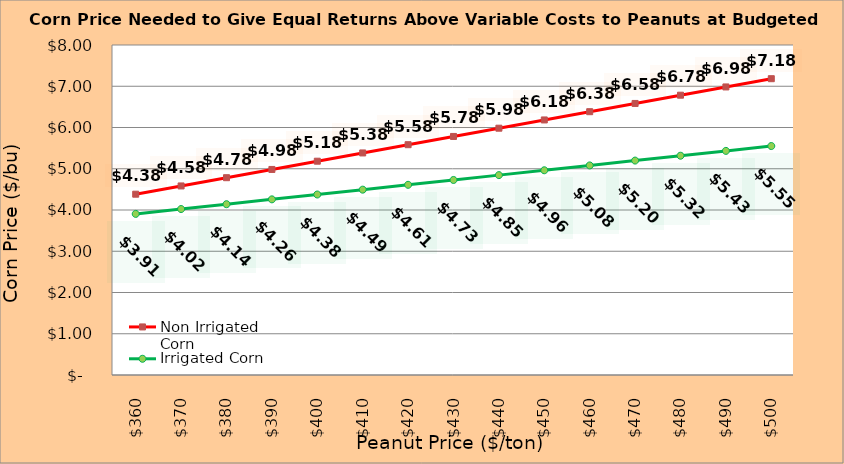
| Category | Non Irrigated Corn | Irrigated Corn |
|---|---|---|
| 360.0 | 4.383 | 3.906 |
| 370.0 | 4.583 | 4.023 |
| 380.0 | 4.783 | 4.141 |
| 390.0 | 4.983 | 4.258 |
| 400.0 | 5.183 | 4.376 |
| 410.0 | 5.383 | 4.493 |
| 420.0 | 5.583 | 4.611 |
| 430.0 | 5.783 | 4.728 |
| 440.0 | 5.983 | 4.846 |
| 450.0 | 6.183 | 4.963 |
| 460.0 | 6.383 | 5.081 |
| 470.0 | 6.583 | 5.198 |
| 480.0 | 6.783 | 5.316 |
| 490.0 | 6.983 | 5.433 |
| 500.0 | 7.183 | 5.551 |